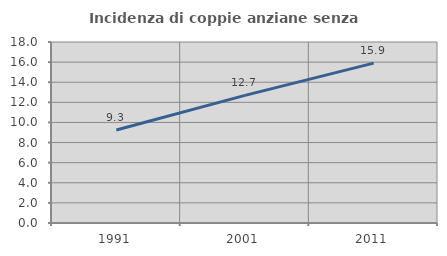
| Category | Incidenza di coppie anziane senza figli  |
|---|---|
| 1991.0 | 9.256 |
| 2001.0 | 12.693 |
| 2011.0 | 15.898 |